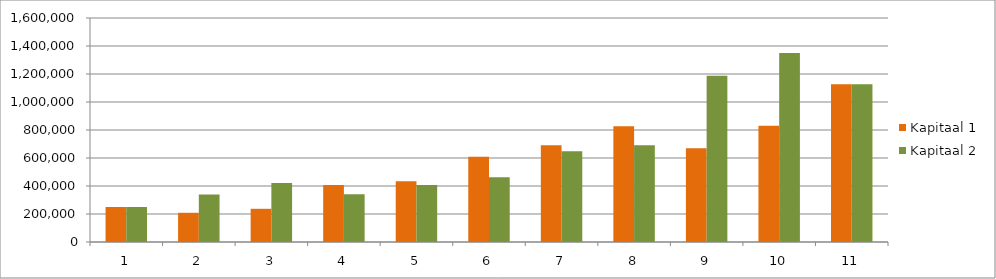
| Category | Kapitaal 1 | Kapitaal 2 |
|---|---|---|
| 0 | 250000 | 250000 |
| 1 | 208738.942 | 338980 |
| 2 | 237118.451 | 420863.636 |
| 3 | 407127.877 | 340821.58 |
| 4 | 434348.265 | 407867.961 |
| 5 | 608734.819 | 462749.477 |
| 6 | 690644.392 | 648538.839 |
| 7 | 826507.875 | 691899.857 |
| 8 | 669318.267 | 1187978.911 |
| 9 | 830998.053 | 1349492.899 |
| 10 | 1126766.878 | 1126766.878 |